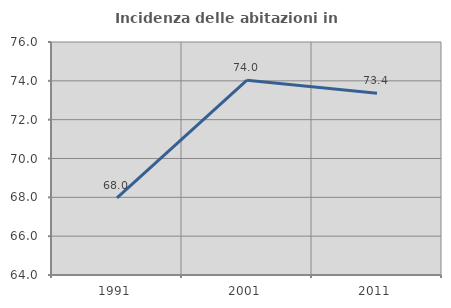
| Category | Incidenza delle abitazioni in proprietà  |
|---|---|
| 1991.0 | 67.966 |
| 2001.0 | 74.032 |
| 2011.0 | 73.366 |